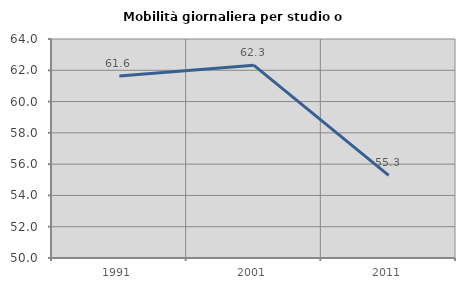
| Category | Mobilità giornaliera per studio o lavoro |
|---|---|
| 1991.0 | 61.635 |
| 2001.0 | 62.319 |
| 2011.0 | 55.285 |